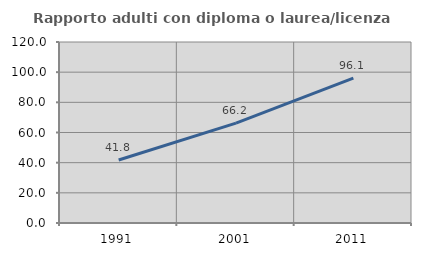
| Category | Rapporto adulti con diploma o laurea/licenza media  |
|---|---|
| 1991.0 | 41.772 |
| 2001.0 | 66.227 |
| 2011.0 | 96.104 |